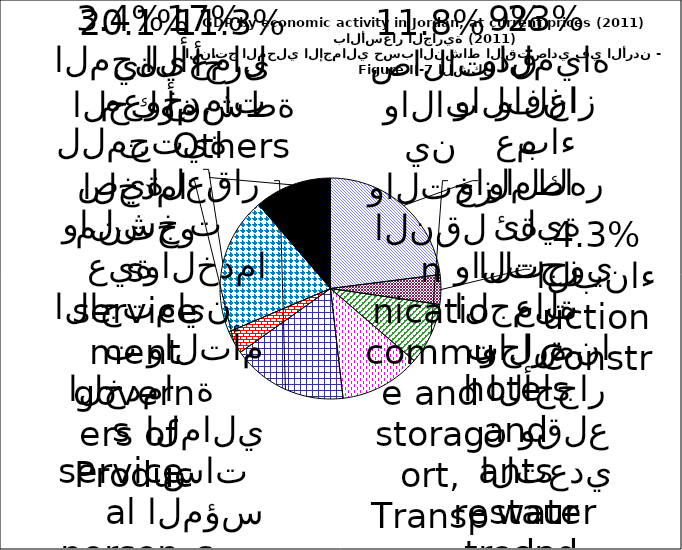
| Category | Mining and quarrying, manufacturing, electricity, gas and water Construction Wholesale and retail trade, restaurants and hotels Transport, storage and communication Financial institutions, insurance, real estate and business services Community social and  |
|---|---|
| Mining and quarrying, manufacturing, electricity, gas and water | 4706.3 |
| Construction | 888 |
| Wholesale and retail trade, restaurants and hotels | 1845.3 |
| Transport, storage and communication | 2426.1 |
| Financial institutions, insurance, real estate and business services | 3483.8 |
| Community social and personal services | 694.7 |
| Producers of government services | 4121.3 |
| Others | 2311 |